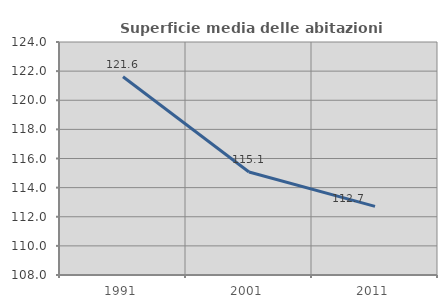
| Category | Superficie media delle abitazioni occupate |
|---|---|
| 1991.0 | 121.613 |
| 2001.0 | 115.077 |
| 2011.0 | 112.712 |